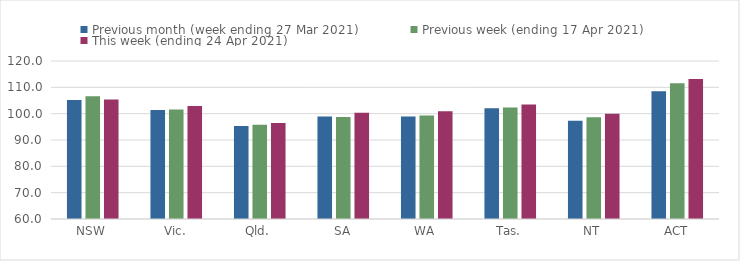
| Category | Previous month (week ending 27 Mar 2021) | Previous week (ending 17 Apr 2021) | This week (ending 24 Apr 2021) |
|---|---|---|---|
| NSW | 105.19 | 106.61 | 105.35 |
| Vic. | 101.39 | 101.55 | 102.87 |
| Qld. | 95.28 | 95.77 | 96.48 |
| SA | 98.88 | 98.78 | 100.34 |
| WA | 98.92 | 99.28 | 100.96 |
| Tas. | 102.06 | 102.34 | 103.47 |
| NT | 97.34 | 98.62 | 99.99 |
| ACT | 108.48 | 111.52 | 113.13 |